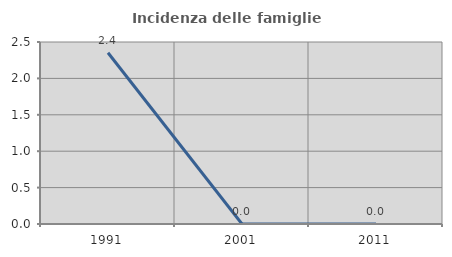
| Category | Incidenza delle famiglie numerose |
|---|---|
| 1991.0 | 2.353 |
| 2001.0 | 0 |
| 2011.0 | 0 |